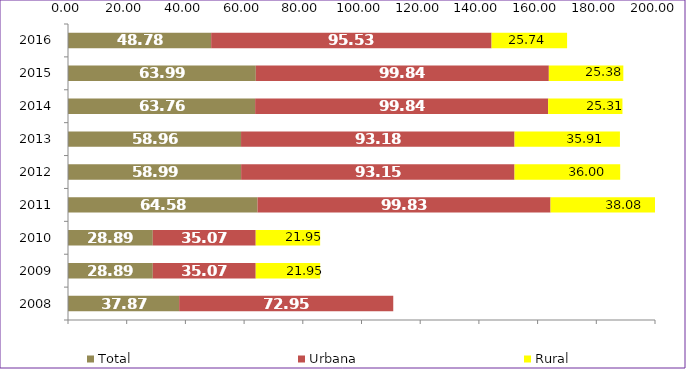
| Category | Total | Urbana | Rural |
|---|---|---|---|
| 2008.0 | 37.87 | 72.95 | 0 |
| 2009.0 | 28.89 | 35.07 | 21.95 |
| 2010.0 | 28.89 | 35.07 | 21.95 |
| 2011.0 | 64.58 | 99.83 | 38.08 |
| 2012.0 | 58.99 | 93.15 | 36 |
| 2013.0 | 58.96 | 93.18 | 35.91 |
| 2014.0 | 63.76 | 99.84 | 25.31 |
| 2015.0 | 63.99 | 99.84 | 25.38 |
| 2016.0 | 48.78 | 95.53 | 25.74 |